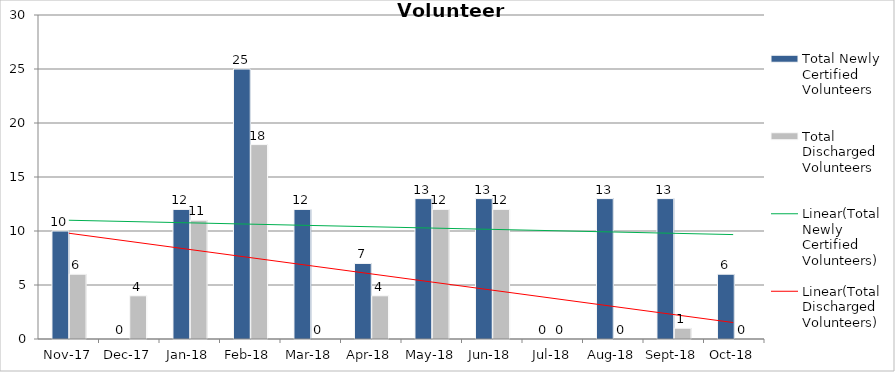
| Category | Total Newly Certified Volunteers | Total Discharged Volunteers |
|---|---|---|
| 2017-11-01 | 10 | 6 |
| 2017-12-01 | 0 | 4 |
| 2018-01-01 | 12 | 11 |
| 2018-02-01 | 25 | 18 |
| 2018-03-01 | 12 | 0 |
| 2018-04-01 | 7 | 4 |
| 2018-05-01 | 13 | 12 |
| 2018-06-01 | 13 | 12 |
| 2018-07-01 | 0 | 0 |
| 2018-08-01 | 13 | 0 |
| 2018-09-01 | 13 | 1 |
| 2018-10-01 | 6 | 0 |